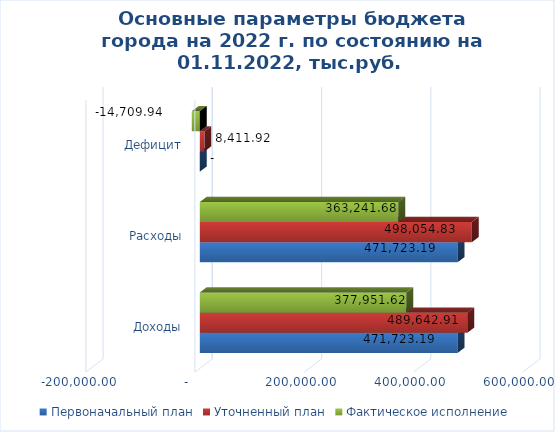
| Category | Первоначальный план | Уточненный план | Фактическое исполнение |
|---|---|---|---|
| Доходы | 471723.19 | 489642.91 | 377951.62 |
| Расходы | 471723.19 | 498054.83 | 363241.68 |
| Дефицит | 0 | 8411.92 | -14709.94 |